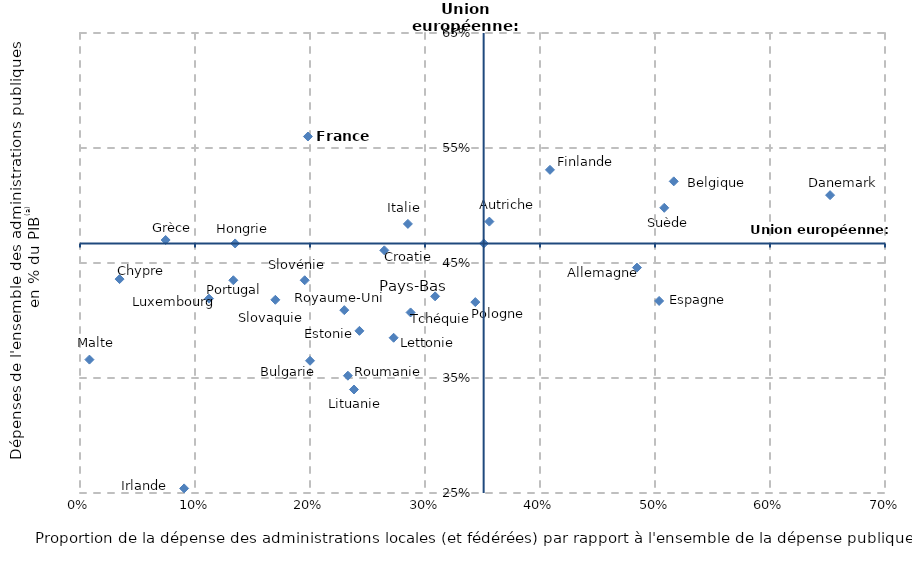
| Category | Series 0 |
|---|---|
| 48.4304932735426 | 44.6 |
| 35.59670781893004 | 48.6 |
| 51.631477927063344 | 52.1 |
| 20.0 | 36.5 |
| 3.4403669724770642 | 43.6 |
| 26.464208242950104 | 46.1 |
| 65.22593320235757 | 50.9 |
| 50.35971223021583 | 41.7 |
| 24.296675191815854 | 39.1 |
| 40.86629001883239 | 53.1 |
| 19.82142857142857 | 56 |
| 7.446808510638298 | 47 |
| 13.49036402569593 | 46.7 |
| 9.05511811023622 | 25.4 |
| 28.512396694214882 | 48.4 |
| 27.27272727272727 | 38.5 |
| 23.823529411764703 | 34 |
| 11.217183770883056 | 41.9 |
| 0.8196721311475409 | 36.6 |
| 30.878859857482183 | 42.1 |
| 34.375 | 41.6 |
| 13.333333333333334 | 43.5 |
| 23.29545454545454 | 35.2 |
| 16.985645933014354 | 41.8 |
| 19.54022988505747 | 43.5 |
| 50.80321285140562 | 49.8 |
| 28.74692874692874 | 40.7 |
| 22.982885085574573 | 40.9 |
| 35.117773019271944 | 46.7 |